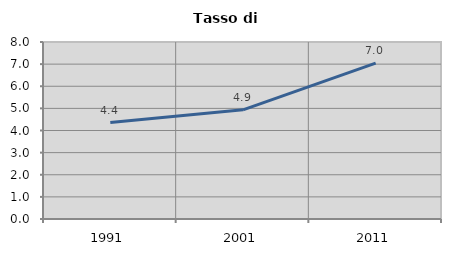
| Category | Tasso di disoccupazione   |
|---|---|
| 1991.0 | 4.36 |
| 2001.0 | 4.933 |
| 2011.0 | 7.042 |